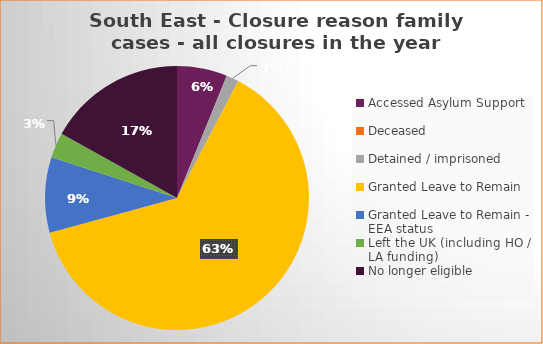
| Category | Total | Percentage |
|---|---|---|
| Accessed Asylum Support | 4 | 0.062 |
| Deceased | 0 | 0 |
| Detained / imprisoned | 1 | 0.015 |
| Granted Leave to Remain | 41 | 0.631 |
| Granted Leave to Remain - EEA status | 6 | 0.092 |
| Left the UK (including HO / LA funding)  | 2 | 0.031 |
| No longer eligible | 11 | 0.169 |